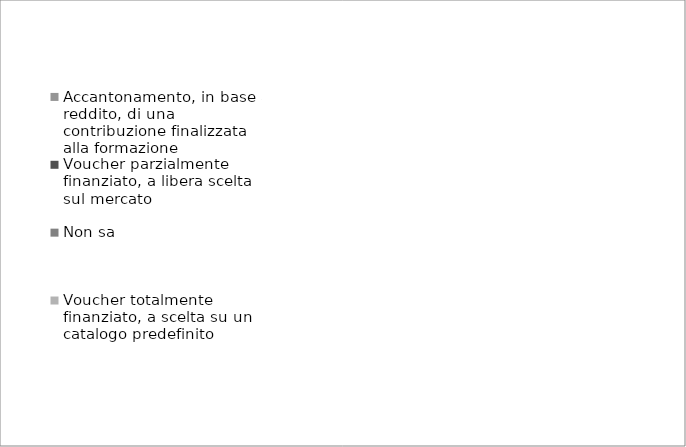
| Category | Agevolazioni fiscali | Voucher totalmente finanziato, a scelta su un catalogo predefinito | Non sa | Voucher parzialmente finanziato, a libera scelta sul mercato | Accantonamento, in base al reddito, di una contribuzione finalizzata alla formazione |
|---|---|---|---|---|---|
| Regolamentati | 48.3 | 28.5 | 9.2 | 9.5 | 4.5 |
| Non regolamentati | 47.8 | 25.9 | 11.5 | 10.2 | 4.6 |